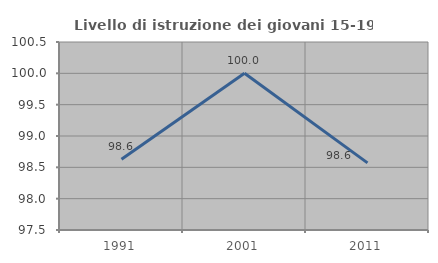
| Category | Livello di istruzione dei giovani 15-19 anni |
|---|---|
| 1991.0 | 98.63 |
| 2001.0 | 100 |
| 2011.0 | 98.571 |